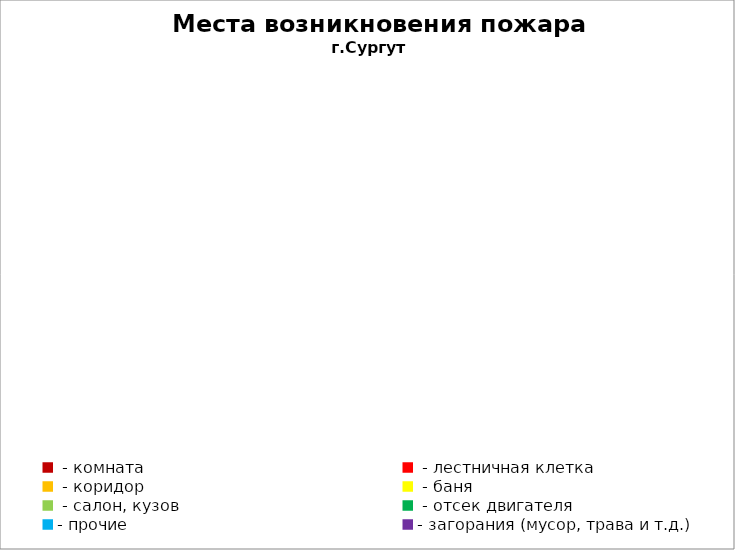
| Category | Места возникновения пожара |
|---|---|
|  - комната | 47 |
|  - лестничная клетка | 15 |
|  - коридор | 7 |
|  - баня | 18 |
|  - салон, кузов | 9 |
|  - отсек двигателя | 19 |
| - прочие | 30 |
| - загорания (мусор, трава и т.д.)  | 145 |